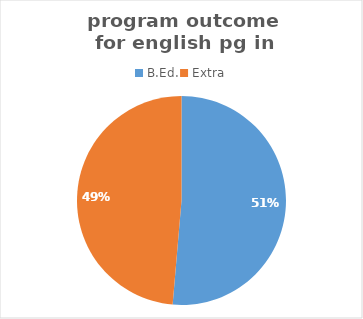
| Category | Series 0 |
|---|---|
| B.Ed. | 19 |
| Extra | 18 |